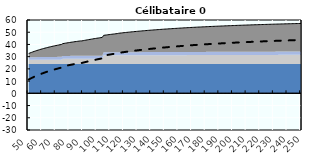
| Category | Coin fiscal moyen (somme des composantes) | Taux moyen d'imposition net en % du salaire brut |
|---|---|---|
| 50.0 | 32.596 | 11.309 |
| 51.0 | 33.042 | 11.896 |
| 52.0 | 33.471 | 12.461 |
| 53.0 | 33.884 | 13.004 |
| 54.0 | 34.281 | 13.527 |
| 55.0 | 34.664 | 14.031 |
| 56.0 | 35.033 | 14.517 |
| 57.0 | 35.39 | 14.986 |
| 58.0 | 35.734 | 15.439 |
| 59.0 | 36.066 | 15.876 |
| 60.0 | 36.388 | 16.299 |
| 61.0 | 36.698 | 16.708 |
| 62.0 | 36.999 | 17.104 |
| 63.0 | 37.29 | 17.487 |
| 64.0 | 37.573 | 17.858 |
| 65.0 | 37.846 | 18.218 |
| 66.0 | 38.111 | 18.567 |
| 67.0 | 38.368 | 18.905 |
| 68.0 | 38.618 | 19.234 |
| 69.0 | 38.861 | 19.553 |
| 70.0 | 39.096 | 19.863 |
| 71.0 | 39.325 | 20.164 |
| 72.0 | 39.547 | 20.457 |
| 73.0 | 39.764 | 20.741 |
| 74.0 | 39.974 | 21.018 |
| 75.0 | 40.648 | 21.904 |
| 76.0 | 40.847 | 22.167 |
| 77.0 | 41.042 | 22.423 |
| 78.0 | 41.231 | 22.672 |
| 79.0 | 41.416 | 22.915 |
| 80.0 | 41.596 | 23.152 |
| 81.0 | 41.771 | 23.383 |
| 82.0 | 41.942 | 23.608 |
| 83.0 | 42.11 | 23.828 |
| 84.0 | 42.273 | 24.042 |
| 85.0 | 42.432 | 24.252 |
| 86.0 | 42.588 | 24.457 |
| 87.0 | 42.74 | 24.657 |
| 88.0 | 42.888 | 24.852 |
| 89.0 | 42.898 | 24.866 |
| 90.0 | 43.118 | 25.154 |
| 91.0 | 43.332 | 25.437 |
| 92.0 | 43.542 | 25.713 |
| 93.0 | 43.748 | 25.983 |
| 94.0 | 43.949 | 26.248 |
| 95.0 | 44.146 | 26.507 |
| 96.0 | 44.338 | 26.761 |
| 97.0 | 44.527 | 27.009 |
| 98.0 | 44.712 | 27.252 |
| 99.0 | 44.893 | 27.491 |
| 100.0 | 45.071 | 27.724 |
| 101.0 | 45.245 | 27.953 |
| 102.0 | 45.415 | 28.178 |
| 103.0 | 45.583 | 28.398 |
| 104.0 | 45.747 | 28.614 |
| 105.0 | 47.43 | 30.829 |
| 106.0 | 47.588 | 31.037 |
| 107.0 | 47.743 | 31.241 |
| 108.0 | 47.895 | 31.441 |
| 109.0 | 48.045 | 31.637 |
| 110.0 | 48.191 | 31.83 |
| 111.0 | 48.335 | 32.019 |
| 112.0 | 48.477 | 32.205 |
| 113.0 | 48.615 | 32.388 |
| 114.0 | 48.752 | 32.568 |
| 115.0 | 48.886 | 32.744 |
| 116.0 | 49.145 | 33.085 |
| 117.0 | 49.273 | 33.254 |
| 118.0 | 49.4 | 33.42 |
| 119.0 | 49.524 | 33.583 |
| 120.0 | 49.646 | 33.744 |
| 121.0 | 49.766 | 33.902 |
| 122.0 | 49.884 | 34.057 |
| 123.0 | 50 | 34.21 |
| 124.0 | 50.114 | 34.36 |
| 125.0 | 50.227 | 34.508 |
| 126.0 | 50.337 | 34.654 |
| 127.0 | 50.446 | 34.797 |
| 128.0 | 50.554 | 34.938 |
| 129.0 | 50.659 | 35.077 |
| 130.0 | 50.763 | 35.214 |
| 131.0 | 50.865 | 35.349 |
| 132.0 | 50.966 | 35.481 |
| 133.0 | 51.065 | 35.612 |
| 134.0 | 51.163 | 35.741 |
| 135.0 | 51.26 | 35.867 |
| 136.0 | 51.354 | 35.992 |
| 137.0 | 51.448 | 36.115 |
| 138.0 | 51.54 | 36.237 |
| 139.0 | 51.631 | 36.356 |
| 140.0 | 51.721 | 36.474 |
| 141.0 | 51.809 | 36.59 |
| 142.0 | 51.896 | 36.705 |
| 143.0 | 51.982 | 36.818 |
| 144.0 | 52.066 | 36.929 |
| 145.0 | 52.15 | 37.039 |
| 146.0 | 52.232 | 37.147 |
| 147.0 | 52.313 | 37.254 |
| 148.0 | 52.394 | 37.359 |
| 149.0 | 52.473 | 37.463 |
| 150.0 | 52.551 | 37.566 |
| 151.0 | 52.628 | 37.667 |
| 152.0 | 52.703 | 37.767 |
| 153.0 | 52.778 | 37.866 |
| 154.0 | 52.852 | 37.963 |
| 155.0 | 52.925 | 38.059 |
| 156.0 | 52.998 | 38.155 |
| 157.0 | 53.072 | 38.252 |
| 158.0 | 53.144 | 38.347 |
| 159.0 | 53.216 | 38.442 |
| 160.0 | 53.287 | 38.535 |
| 161.0 | 53.357 | 38.627 |
| 162.0 | 53.426 | 38.718 |
| 163.0 | 53.495 | 38.808 |
| 164.0 | 53.562 | 38.897 |
| 165.0 | 53.629 | 38.985 |
| 166.0 | 53.692 | 39.068 |
| 167.0 | 53.754 | 39.15 |
| 168.0 | 53.816 | 39.231 |
| 169.0 | 53.877 | 39.311 |
| 170.0 | 53.937 | 39.39 |
| 171.0 | 53.997 | 39.469 |
| 172.0 | 54.055 | 39.546 |
| 173.0 | 54.113 | 39.622 |
| 174.0 | 54.171 | 39.698 |
| 175.0 | 54.228 | 39.773 |
| 176.0 | 54.284 | 39.846 |
| 177.0 | 54.339 | 39.919 |
| 178.0 | 54.394 | 39.992 |
| 179.0 | 54.448 | 40.063 |
| 180.0 | 54.502 | 40.133 |
| 181.0 | 54.555 | 40.203 |
| 182.0 | 54.607 | 40.272 |
| 183.0 | 54.659 | 40.341 |
| 184.0 | 54.711 | 40.408 |
| 185.0 | 54.761 | 40.475 |
| 186.0 | 54.811 | 40.541 |
| 187.0 | 54.861 | 40.606 |
| 188.0 | 54.91 | 40.671 |
| 189.0 | 54.959 | 40.735 |
| 190.0 | 55.007 | 40.798 |
| 191.0 | 55.055 | 40.861 |
| 192.0 | 55.102 | 40.923 |
| 193.0 | 55.148 | 40.984 |
| 194.0 | 55.195 | 41.045 |
| 195.0 | 55.24 | 41.105 |
| 196.0 | 55.285 | 41.165 |
| 197.0 | 55.33 | 41.224 |
| 198.0 | 55.375 | 41.282 |
| 199.0 | 55.418 | 41.34 |
| 200.0 | 55.462 | 41.397 |
| 201.0 | 55.505 | 41.453 |
| 202.0 | 55.547 | 41.509 |
| 203.0 | 55.59 | 41.565 |
| 204.0 | 55.631 | 41.62 |
| 205.0 | 55.673 | 41.674 |
| 206.0 | 55.713 | 41.728 |
| 207.0 | 55.754 | 41.781 |
| 208.0 | 55.794 | 41.834 |
| 209.0 | 55.834 | 41.886 |
| 210.0 | 55.873 | 41.938 |
| 211.0 | 55.912 | 41.989 |
| 212.0 | 55.951 | 42.04 |
| 213.0 | 55.989 | 42.091 |
| 214.0 | 56.027 | 42.14 |
| 215.0 | 56.065 | 42.19 |
| 216.0 | 56.102 | 42.239 |
| 217.0 | 56.139 | 42.287 |
| 218.0 | 56.175 | 42.335 |
| 219.0 | 56.211 | 42.383 |
| 220.0 | 56.247 | 42.43 |
| 221.0 | 56.283 | 42.477 |
| 222.0 | 56.318 | 42.523 |
| 223.0 | 56.353 | 42.569 |
| 224.0 | 56.388 | 42.615 |
| 225.0 | 56.422 | 42.66 |
| 226.0 | 56.456 | 42.705 |
| 227.0 | 56.49 | 42.749 |
| 228.0 | 56.523 | 42.793 |
| 229.0 | 56.556 | 42.836 |
| 230.0 | 56.589 | 42.88 |
| 231.0 | 56.621 | 42.922 |
| 232.0 | 56.654 | 42.965 |
| 233.0 | 56.686 | 43.007 |
| 234.0 | 56.717 | 43.049 |
| 235.0 | 56.749 | 43.09 |
| 236.0 | 56.78 | 43.131 |
| 237.0 | 56.811 | 43.172 |
| 238.0 | 56.841 | 43.212 |
| 239.0 | 56.872 | 43.252 |
| 240.0 | 56.902 | 43.291 |
| 241.0 | 56.932 | 43.331 |
| 242.0 | 56.961 | 43.37 |
| 243.0 | 56.991 | 43.408 |
| 244.0 | 57.02 | 43.447 |
| 245.0 | 57.049 | 43.485 |
| 246.0 | 57.077 | 43.523 |
| 247.0 | 57.106 | 43.56 |
| 248.0 | 57.134 | 43.597 |
| 249.0 | 57.162 | 43.634 |
| 250.0 | 57.19 | 43.67 |